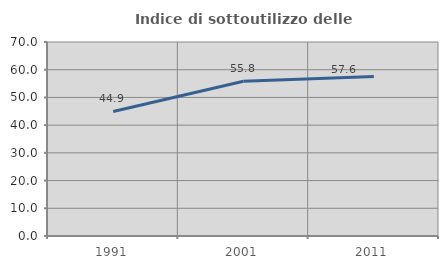
| Category | Indice di sottoutilizzo delle abitazioni  |
|---|---|
| 1991.0 | 44.937 |
| 2001.0 | 55.814 |
| 2011.0 | 57.595 |